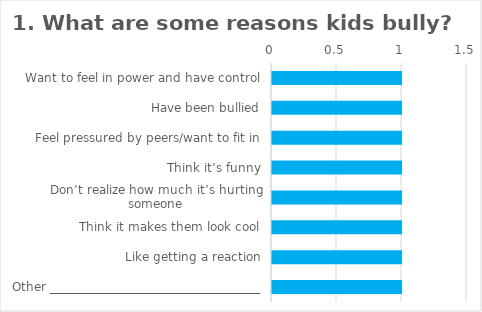
| Category | Field1 |
|---|---|
| Want to feel in power and have control | 1 |
| Have been bullied | 1 |
| Feel pressured by peers/want to fit in | 1 |
| Think it’s funny | 1 |
| Don’t realize how much it’s hurting someone | 1 |
| Think it makes them look cool | 1 |
| Like getting a reaction | 1 |
| Other ___________________________________ | 1 |